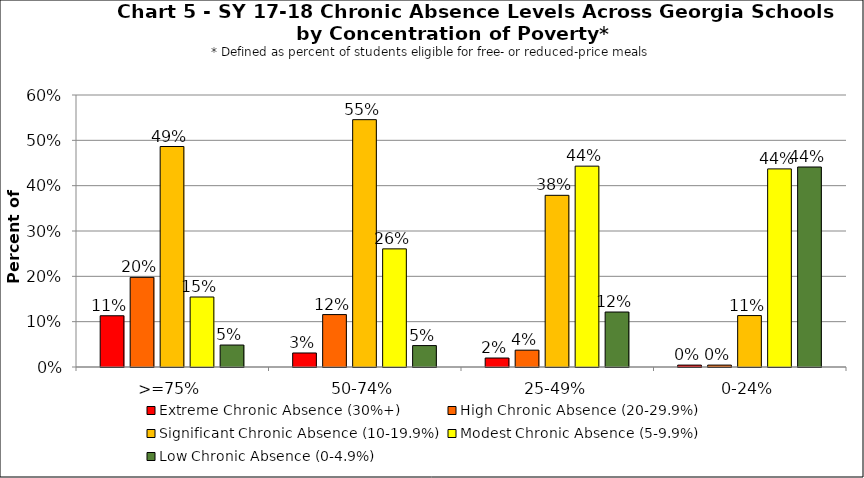
| Category | Extreme Chronic Absence (30%+) | High Chronic Absence (20-29.9%) | Significant Chronic Absence (10-19.9%) | Modest Chronic Absence (5-9.9%) | Low Chronic Absence (0-4.9%) |
|---|---|---|---|---|---|
| 0 | 0.113 | 0.198 | 0.486 | 0.154 | 0.048 |
| 1 | 0.031 | 0.116 | 0.546 | 0.261 | 0.047 |
| 2 | 0.02 | 0.037 | 0.379 | 0.443 | 0.121 |
| 3 | 0.004 | 0.004 | 0.113 | 0.437 | 0.441 |